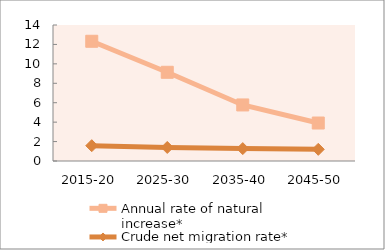
| Category | Annual rate of natural increase* | Crude net migration rate* |
|---|---|---|
| 2015-20 | 12.325 | 1.575 |
| 2025-30 | 9.132 | 1.393 |
| 2035-40 | 5.77 | 1.277 |
| 2045-50 | 3.909 | 1.202 |